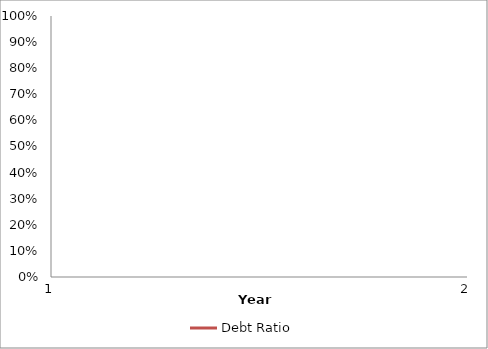
| Category | Debt Ratio |
|---|---|
| 0 | 0 |
| 1 | 0 |
| 2 | 0 |
| 3 | 0 |
| 4 | 0 |
| 5 | 0 |
| 6 | 0 |
| 7 | 0 |
| 8 | 0 |
| 9 | 0 |